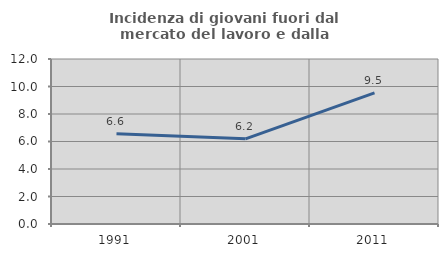
| Category | Incidenza di giovani fuori dal mercato del lavoro e dalla formazione  |
|---|---|
| 1991.0 | 6.572 |
| 2001.0 | 6.194 |
| 2011.0 | 9.531 |